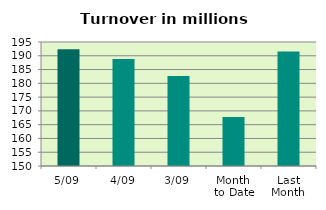
| Category | Series 0 |
|---|---|
| 5/09 | 192.399 |
| 4/09 | 188.852 |
| 3/09 | 182.704 |
| Month 
to Date | 167.791 |
| Last
Month | 191.512 |